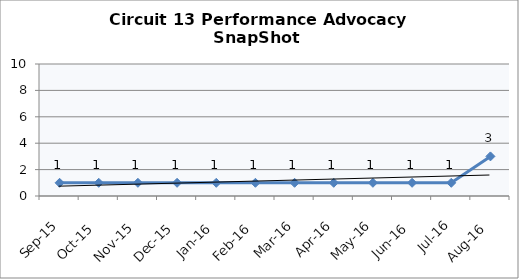
| Category | Circuit 13 |
|---|---|
| Sep-15 | 1 |
| Oct-15 | 1 |
| Nov-15 | 1 |
| Dec-15 | 1 |
| Jan-16 | 1 |
| Feb-16 | 1 |
| Mar-16 | 1 |
| Apr-16 | 1 |
| May-16 | 1 |
| Jun-16 | 1 |
| Jul-16 | 1 |
| Aug-16 | 3 |